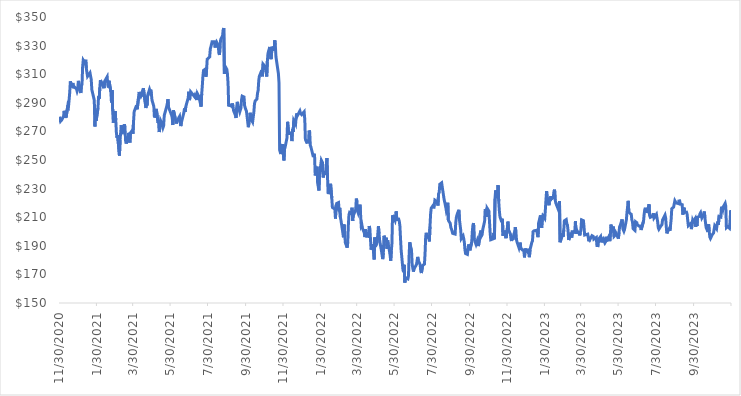
| Category | Adj Close |
|---|---|
| 11/30/20 | 280.23 |
| 12/1/20 | 279.11 |
| 12/2/20 | 277.06 |
| 12/3/20 | 277.29 |
| 12/4/20 | 278 |
| 12/7/20 | 280.8 |
| 12/8/20 | 284.38 |
| 12/9/20 | 279.42 |
| 12/10/20 | 281.16 |
| 12/11/20 | 279.68 |
| 12/14/20 | 288.33 |
| 12/15/20 | 287.53 |
| 12/16/20 | 292.17 |
| 12/17/20 | 297.35 |
| 12/18/20 | 305 |
| 12/21/20 | 300.88 |
| 12/22/20 | 303.86 |
| 12/23/20 | 300.18 |
| 12/24/20 | 301.39 |
| 12/28/20 | 299.65 |
| 12/29/20 | 298.11 |
| 12/30/20 | 299.41 |
| 12/31/20 | 305.34 |
| 1/4/21 | 296.84 |
| 1/5/21 | 301.7 |
| 1/6/21 | 302.87 |
| 1/7/21 | 315.2 |
| 1/8/21 | 319.85 |
| 1/11/21 | 317.81 |
| 1/12/21 | 320.13 |
| 1/13/21 | 314.33 |
| 1/14/21 | 311.11 |
| 1/15/21 | 308.51 |
| 1/19/21 | 310.97 |
| 1/20/21 | 308.58 |
| 1/21/21 | 306.46 |
| 1/22/21 | 299.17 |
| 1/25/21 | 293.64 |
| 1/26/21 | 291.75 |
| 1/27/21 | 273.47 |
| 1/28/21 | 284.22 |
| 1/29/21 | 277.43 |
| 2/1/21 | 286.32 |
| 2/2/21 | 294.61 |
| 2/3/21 | 292.85 |
| 2/4/21 | 300.49 |
| 2/5/21 | 305.86 |
| 2/8/21 | 302.81 |
| 2/9/21 | 304.5 |
| 2/10/21 | 301.71 |
| 2/11/21 | 300.21 |
| 2/12/21 | 305.14 |
| 2/16/21 | 308.22 |
| 2/17/21 | 302.52 |
| 2/18/21 | 300.72 |
| 2/19/21 | 305.4 |
| 2/22/21 | 297.7 |
| 2/23/21 | 290.25 |
| 2/24/21 | 298.91 |
| 2/25/21 | 284.03 |
| 2/26/21 | 276 |
| 3/1/21 | 284.27 |
| 3/2/21 | 277.92 |
| 3/3/21 | 269.3 |
| 3/4/21 | 265.44 |
| 3/5/21 | 267.39 |
| 3/8/21 | 253.1 |
| 3/9/21 | 263.97 |
| 3/10/21 | 263.64 |
| 3/11/21 | 274.36 |
| 3/12/21 | 268.11 |
| 3/15/21 | 273.02 |
| 3/16/21 | 275.01 |
| 3/17/21 | 272.84 |
| 3/18/21 | 263.44 |
| 3/19/21 | 261.5 |
| 3/22/21 | 265.96 |
| 3/23/21 | 269 |
| 3/24/21 | 263.18 |
| 3/25/21 | 262.19 |
| 3/26/21 | 269.01 |
| 3/29/21 | 270.78 |
| 3/30/21 | 268.43 |
| 3/31/21 | 277.15 |
| 4/1/21 | 283.9 |
| 4/5/21 | 288.32 |
| 4/6/21 | 285.5 |
| 4/7/21 | 286.12 |
| 4/8/21 | 293.43 |
| 4/9/21 | 297.57 |
| 4/12/21 | 294.5 |
| 4/13/21 | 295.35 |
| 4/14/21 | 294.35 |
| 4/15/21 | 298.86 |
| 4/16/21 | 300.16 |
| 4/19/21 | 290.2 |
| 4/20/21 | 286.36 |
| 4/21/21 | 288.87 |
| 4/22/21 | 288 |
| 4/23/21 | 295.27 |
| 4/26/21 | 299.34 |
| 4/27/21 | 297.87 |
| 4/28/21 | 299.23 |
| 4/29/21 | 296.28 |
| 4/30/21 | 291.91 |
| 5/3/21 | 287.5 |
| 5/4/21 | 279.73 |
| 5/5/21 | 281.08 |
| 5/6/21 | 284.35 |
| 5/7/21 | 285.76 |
| 5/10/21 | 276.05 |
| 5/11/21 | 277.42 |
| 5/12/21 | 269.54 |
| 5/13/21 | 269.72 |
| 5/14/21 | 277.63 |
| 5/17/21 | 274.78 |
| 5/18/21 | 272.75 |
| 5/19/21 | 273.97 |
| 5/20/21 | 281.16 |
| 5/21/21 | 281.68 |
| 5/24/21 | 287.48 |
| 5/25/21 | 289.47 |
| 5/26/21 | 292.51 |
| 5/27/21 | 286.67 |
| 5/28/21 | 285.86 |
| 6/1/21 | 281.3 |
| 6/2/21 | 279.67 |
| 6/3/21 | 274.47 |
| 6/4/21 | 284.78 |
| 6/7/21 | 278.89 |
| 6/8/21 | 278.66 |
| 6/9/21 | 275.5 |
| 6/10/21 | 277.5 |
| 6/11/21 | 277.51 |
| 6/14/21 | 280.52 |
| 6/15/21 | 276.76 |
| 6/16/21 | 273.71 |
| 6/17/21 | 276.34 |
| 6/18/21 | 277.98 |
| 6/21/21 | 283.22 |
| 6/22/21 | 286.07 |
| 6/23/21 | 283.67 |
| 6/24/21 | 286.96 |
| 6/25/21 | 288.74 |
| 6/28/21 | 293.36 |
| 6/29/21 | 297.74 |
| 6/30/21 | 291.9 |
| 7/1/21 | 293.7 |
| 7/2/21 | 297.74 |
| 7/6/21 | 295.6 |
| 7/7/21 | 296.11 |
| 7/8/21 | 294.47 |
| 7/9/21 | 295.38 |
| 7/12/21 | 291.93 |
| 7/13/21 | 296.42 |
| 7/14/21 | 297.1 |
| 7/15/21 | 294.79 |
| 7/16/21 | 293.33 |
| 7/19/21 | 287.31 |
| 7/20/21 | 296.12 |
| 7/21/21 | 301.78 |
| 7/22/21 | 308.51 |
| 7/23/21 | 312.65 |
| 7/26/21 | 313.62 |
| 7/27/21 | 308.25 |
| 7/28/21 | 313.13 |
| 7/29/21 | 320.5 |
| 7/30/21 | 321.13 |
| 8/2/21 | 322.07 |
| 8/3/21 | 327.61 |
| 8/4/21 | 329.09 |
| 8/5/21 | 328.82 |
| 8/6/21 | 332.77 |
| 8/9/21 | 332.77 |
| 8/10/21 | 331.28 |
| 8/11/21 | 328.64 |
| 8/12/21 | 332.05 |
| 8/13/21 | 332.78 |
| 8/16/21 | 330.18 |
| 8/17/21 | 324.7 |
| 8/18/21 | 323.52 |
| 8/19/21 | 330.35 |
| 8/20/21 | 334.38 |
| 8/23/21 | 336.76 |
| 8/24/21 | 341.07 |
| 8/25/21 | 342.27 |
| 8/26/21 | 310.19 |
| 8/27/21 | 315.64 |
| 8/30/21 | 313.39 |
| 8/31/21 | 310.09 |
| 9/1/21 | 303.24 |
| 9/2/21 | 287.47 |
| 9/3/21 | 288.75 |
| 9/7/21 | 287.46 |
| 9/8/21 | 289.56 |
| 9/9/21 | 287.68 |
| 9/10/21 | 284.43 |
| 9/13/21 | 281.28 |
| 9/14/21 | 279.35 |
| 9/15/21 | 286.62 |
| 9/16/21 | 290.68 |
| 9/17/21 | 288.15 |
| 9/20/21 | 283.6 |
| 9/21/21 | 283.19 |
| 9/22/21 | 286.42 |
| 9/23/21 | 292.16 |
| 9/24/21 | 294.67 |
| 9/27/21 | 294.06 |
| 9/28/21 | 287.85 |
| 9/29/21 | 287.99 |
| 9/30/21 | 285.17 |
| 10/1/21 | 284.06 |
| 10/4/21 | 272.93 |
| 10/5/21 | 275.98 |
| 10/6/21 | 277.42 |
| 10/7/21 | 283.02 |
| 10/8/21 | 278.94 |
| 10/11/21 | 276.54 |
| 10/12/21 | 275.91 |
| 10/13/21 | 283.45 |
| 10/14/21 | 289.17 |
| 10/15/21 | 291.19 |
| 10/18/21 | 292.67 |
| 10/19/21 | 296.69 |
| 10/20/21 | 298.64 |
| 10/21/21 | 305.68 |
| 10/22/21 | 308.58 |
| 10/25/21 | 311.79 |
| 10/26/21 | 312.8 |
| 10/27/21 | 308.51 |
| 10/28/21 | 317.1 |
| 10/29/21 | 317.61 |
| 11/1/21 | 315.01 |
| 11/2/21 | 314.92 |
| 11/3/21 | 308.37 |
| 11/4/21 | 318.97 |
| 11/5/21 | 324.52 |
| 11/8/21 | 329.07 |
| 11/9/21 | 329.4 |
| 11/10/21 | 320.53 |
| 11/11/21 | 325.21 |
| 11/12/21 | 329.32 |
| 11/15/21 | 326.39 |
| 11/16/21 | 333.64 |
| 11/17/21 | 330.55 |
| 11/18/21 | 322.18 |
| 11/19/21 | 322.52 |
| 11/22/21 | 310.48 |
| 11/23/21 | 304 |
| 11/24/21 | 256.9 |
| 11/26/21 | 254.17 |
| 11/29/21 | 261.15 |
| 11/30/21 | 254.19 |
| 12/1/21 | 249.68 |
| 12/2/21 | 257.66 |
| 12/3/21 | 259.02 |
| 12/6/21 | 265.56 |
| 12/7/21 | 276.7 |
| 12/8/21 | 276.29 |
| 12/9/21 | 267.67 |
| 12/10/21 | 269 |
| 12/13/21 | 268.88 |
| 12/14/21 | 263.22 |
| 12/15/21 | 271.73 |
| 12/16/21 | 269.61 |
| 12/17/21 | 277.65 |
| 12/20/21 | 275.12 |
| 12/21/21 | 280.42 |
| 12/22/21 | 282.61 |
| 12/23/21 | 280.99 |
| 12/27/21 | 284.3 |
| 12/28/21 | 282.77 |
| 12/29/21 | 282.57 |
| 12/30/21 | 281.71 |
| 12/31/21 | 281.19 |
| 1/3/22 | 283.72 |
| 1/4/22 | 278.19 |
| 1/5/22 | 264.32 |
| 1/6/22 | 264.11 |
| 1/7/22 | 262.32 |
| 1/10/22 | 262.39 |
| 1/11/22 | 270.63 |
| 1/12/22 | 269.6 |
| 1/13/22 | 260.17 |
| 1/14/22 | 259.1 |
| 1/18/22 | 252.03 |
| 1/19/22 | 254.35 |
| 1/20/22 | 252.41 |
| 1/21/22 | 239.19 |
| 1/24/22 | 245.35 |
| 1/25/22 | 233.78 |
| 1/26/22 | 233.28 |
| 1/27/22 | 228.66 |
| 1/28/22 | 239.54 |
| 1/31/22 | 249.79 |
| 2/1/22 | 249.77 |
| 2/2/22 | 248 |
| 2/3/22 | 237.76 |
| 2/4/22 | 241.24 |
| 2/7/22 | 240.48 |
| 2/8/22 | 241.1 |
| 2/9/22 | 251.34 |
| 2/10/22 | 238.52 |
| 2/11/22 | 227.13 |
| 2/14/22 | 226.9 |
| 2/15/22 | 233.38 |
| 2/16/22 | 233.74 |
| 2/17/22 | 223.39 |
| 2/18/22 | 216.84 |
| 2/22/22 | 215.65 |
| 2/23/22 | 209.02 |
| 2/24/22 | 218.18 |
| 2/25/22 | 219.62 |
| 2/28/22 | 220.23 |
| 3/1/22 | 214 |
| 3/2/22 | 216.51 |
| 3/3/22 | 210 |
| 3/4/22 | 207.66 |
| 3/7/22 | 199.09 |
| 3/8/22 | 195.95 |
| 3/9/22 | 204.88 |
| 3/10/22 | 199.79 |
| 3/11/22 | 192.31 |
| 3/14/22 | 188.7 |
| 3/15/22 | 192.43 |
| 3/16/22 | 204.5 |
| 3/17/22 | 211.65 |
| 3/18/22 | 213.3 |
| 3/21/22 | 212.38 |
| 3/22/22 | 216.66 |
| 3/23/22 | 207.34 |
| 3/24/22 | 213.05 |
| 3/25/22 | 212.14 |
| 3/28/22 | 215.41 |
| 3/29/22 | 223 |
| 3/30/22 | 221 |
| 3/31/22 | 214.35 |
| 4/1/22 | 213.04 |
| 4/4/22 | 218.77 |
| 4/5/22 | 211.55 |
| 4/6/22 | 203.94 |
| 4/7/22 | 204.77 |
| 4/8/22 | 202.25 |
| 4/11/22 | 199.03 |
| 4/12/22 | 196.14 |
| 4/13/22 | 201.74 |
| 4/14/22 | 196.73 |
| 4/18/22 | 196.54 |
| 4/19/22 | 203.8 |
| 4/20/22 | 201.92 |
| 4/21/22 | 195.13 |
| 4/22/22 | 187.31 |
| 4/25/22 | 191.15 |
| 4/26/22 | 185.59 |
| 4/27/22 | 180.47 |
| 4/28/22 | 195.84 |
| 4/29/22 | 189.28 |
| 5/2/22 | 192.9 |
| 5/3/22 | 193.22 |
| 5/4/22 | 203.75 |
| 5/5/22 | 198.39 |
| 5/6/22 | 193.77 |
| 5/9/22 | 186.32 |
| 5/10/22 | 186.41 |
| 5/11/22 | 180.68 |
| 5/12/22 | 185.05 |
| 5/13/22 | 197.07 |
| 5/16/22 | 192.58 |
| 5/17/22 | 195.64 |
| 5/18/22 | 187.98 |
| 5/19/22 | 193.72 |
| 5/20/22 | 191.41 |
| 5/23/22 | 183.51 |
| 5/24/22 | 179.55 |
| 5/25/22 | 186.53 |
| 5/26/22 | 191.63 |
| 5/27/22 | 211.38 |
| 5/31/22 | 207.75 |
| 6/1/22 | 207.38 |
| 6/2/22 | 214.09 |
| 6/3/22 | 208.37 |
| 6/6/22 | 208.6 |
| 6/7/22 | 207.17 |
| 6/8/22 | 203.73 |
| 6/9/22 | 195.06 |
| 6/10/22 | 187.08 |
| 6/13/22 | 173.1 |
| 6/14/22 | 171.59 |
| 6/15/22 | 176.71 |
| 6/16/22 | 164.31 |
| 6/17/22 | 167.77 |
| 6/21/22 | 166.88 |
| 6/22/22 | 169.15 |
| 6/23/22 | 183.41 |
| 6/24/22 | 192.48 |
| 6/27/22 | 185.87 |
| 6/28/22 | 176.81 |
| 6/29/22 | 176.85 |
| 6/30/22 | 171.96 |
| 7/1/22 | 173.86 |
| 7/5/22 | 176.9 |
| 7/6/22 | 176.73 |
| 7/7/22 | 182.25 |
| 7/8/22 | 179.83 |
| 7/11/22 | 176.72 |
| 7/12/22 | 172.33 |
| 7/13/22 | 170.95 |
| 7/14/22 | 170.96 |
| 7/15/22 | 176.21 |
| 7/18/22 | 177.22 |
| 7/19/22 | 184.76 |
| 7/20/22 | 196.38 |
| 7/21/22 | 199.1 |
| 7/22/22 | 195.95 |
| 7/25/22 | 195.71 |
| 7/26/22 | 193.07 |
| 7/27/22 | 203.41 |
| 7/28/22 | 212.16 |
| 7/29/22 | 216.32 |
| 8/1/22 | 218.14 |
| 8/2/22 | 216.18 |
| 8/3/22 | 218.44 |
| 8/4/22 | 221.94 |
| 8/5/22 | 221.7 |
| 8/8/22 | 220.69 |
| 8/9/22 | 218.14 |
| 8/10/22 | 226.32 |
| 8/11/22 | 227.26 |
| 8/12/22 | 233.01 |
| 8/15/22 | 234.04 |
| 8/16/22 | 233.64 |
| 8/17/22 | 228.2 |
| 8/18/22 | 228.86 |
| 8/19/22 | 222.59 |
| 8/22/22 | 216.4 |
| 8/23/22 | 213.63 |
| 8/24/22 | 214.43 |
| 8/25/22 | 220.15 |
| 8/26/22 | 207.77 |
| 8/29/22 | 205.71 |
| 8/30/22 | 202.81 |
| 8/31/22 | 201.74 |
| 9/1/22 | 201.95 |
| 9/2/22 | 198.69 |
| 9/6/22 | 198.18 |
| 9/7/22 | 206.19 |
| 9/8/22 | 209.82 |
| 9/9/22 | 211.68 |
| 9/12/22 | 215.16 |
| 9/13/22 | 208.34 |
| 9/14/22 | 208.52 |
| 9/15/22 | 201.3 |
| 9/16/22 | 194.97 |
| 9/19/22 | 196.89 |
| 9/20/22 | 194.97 |
| 9/21/22 | 192.42 |
| 9/22/22 | 187.15 |
| 9/23/22 | 184.56 |
| 9/26/22 | 183.99 |
| 9/27/22 | 187.96 |
| 9/28/22 | 190.98 |
| 9/29/22 | 189.46 |
| 9/30/22 | 186.8 |
| 10/3/22 | 192.46 |
| 10/4/22 | 199.99 |
| 10/5/22 | 204.53 |
| 10/6/22 | 205.87 |
| 10/7/22 | 194.74 |
| 10/10/22 | 191.03 |
| 10/11/22 | 191.03 |
| 10/12/22 | 193.64 |
| 10/13/22 | 193.85 |
| 10/14/22 | 189.81 |
| 10/17/22 | 198.7 |
| 10/18/22 | 200.7 |
| 10/19/22 | 197.02 |
| 10/20/22 | 197.83 |
| 10/21/22 | 201.39 |
| 10/24/22 | 207.09 |
| 10/25/22 | 215.72 |
| 10/26/22 | 214.56 |
| 10/27/22 | 210.15 |
| 10/28/22 | 216.39 |
| 10/31/22 | 214.3 |
| 11/1/22 | 214.05 |
| 11/2/22 | 199.38 |
| 11/3/22 | 194.22 |
| 11/4/22 | 193.69 |
| 11/7/22 | 194.88 |
| 11/8/22 | 199.01 |
| 11/9/22 | 194.61 |
| 11/10/22 | 222.96 |
| 11/11/22 | 228.8 |
| 11/14/22 | 223.31 |
| 11/15/22 | 232.3 |
| 11/16/22 | 221.14 |
| 11/17/22 | 214.68 |
| 11/18/22 | 210.37 |
| 11/21/22 | 206.5 |
| 11/22/22 | 208.9 |
| 11/23/22 | 197.07 |
| 11/25/22 | 200.66 |
| 11/28/22 | 195.35 |
| 11/29/22 | 195.18 |
| 11/30/22 | 201.95 |
| 12/1/22 | 206.93 |
| 12/2/22 | 201.11 |
| 12/5/22 | 198.39 |
| 12/6/22 | 194.61 |
| 12/7/22 | 193.34 |
| 12/8/22 | 196.63 |
| 12/9/22 | 194.31 |
| 12/12/22 | 199.88 |
| 12/13/22 | 203.02 |
| 12/14/22 | 200.06 |
| 12/15/22 | 194.11 |
| 12/16/22 | 192.4 |
| 12/19/22 | 188.54 |
| 12/20/22 | 187.92 |
| 12/21/22 | 192.23 |
| 12/22/22 | 188.1 |
| 12/23/22 | 188.16 |
| 12/27/22 | 186.29 |
| 12/28/22 | 181.9 |
| 12/29/22 | 188.12 |
| 12/30/22 | 186.87 |
| 1/3/23 | 185.15 |
| 1/4/23 | 187.96 |
| 1/5/23 | 182.07 |
| 1/6/23 | 187.19 |
| 1/9/23 | 192.47 |
| 1/10/23 | 193.43 |
| 1/11/23 | 199.93 |
| 1/12/23 | 199.96 |
| 1/13/23 | 200.59 |
| 1/17/23 | 200.7 |
| 1/18/23 | 198.02 |
| 1/19/23 | 196.05 |
| 1/20/23 | 205.9 |
| 1/23/23 | 211.29 |
| 1/24/23 | 206.43 |
| 1/25/23 | 202.5 |
| 1/26/23 | 208.46 |
| 1/27/23 | 210.88 |
| 1/30/23 | 209.12 |
| 1/31/23 | 215.16 |
| 2/1/23 | 222.19 |
| 2/2/23 | 228.22 |
| 2/3/23 | 223.66 |
| 2/6/23 | 218.34 |
| 2/7/23 | 223.65 |
| 2/8/23 | 221.32 |
| 2/9/23 | 224.65 |
| 2/10/23 | 222.8 |
| 2/13/23 | 224 |
| 2/14/23 | 228.04 |
| 2/15/23 | 229.28 |
| 2/16/23 | 222.13 |
| 2/17/23 | 219.98 |
| 2/21/23 | 215.55 |
| 2/22/23 | 216.7 |
| 2/23/23 | 221.16 |
| 2/24/23 | 192.53 |
| 2/27/23 | 196.68 |
| 2/28/23 | 198.69 |
| 3/1/23 | 196.38 |
| 3/2/23 | 201.13 |
| 3/3/23 | 207.46 |
| 3/6/23 | 208.33 |
| 3/7/23 | 205.48 |
| 3/8/23 | 204.51 |
| 3/9/23 | 200.49 |
| 3/10/23 | 194.02 |
| 3/13/23 | 197.87 |
| 3/14/23 | 199.22 |
| 3/15/23 | 195.79 |
| 3/16/23 | 200.59 |
| 3/17/23 | 199.11 |
| 3/20/23 | 200.42 |
| 3/21/23 | 207.15 |
| 3/22/23 | 198.38 |
| 3/23/23 | 201.14 |
| 3/24/23 | 200.22 |
| 3/27/23 | 198.75 |
| 3/28/23 | 197.27 |
| 3/29/23 | 199.16 |
| 3/30/23 | 201.61 |
| 3/31/23 | 208.16 |
| 4/3/23 | 207.58 |
| 4/4/23 | 203.32 |
| 4/5/23 | 197.55 |
| 4/6/23 | 197.34 |
| 4/10/23 | 198.14 |
| 4/11/23 | 197.78 |
| 4/12/23 | 193.16 |
| 4/13/23 | 196.31 |
| 4/14/23 | 194.66 |
| 4/17/23 | 197.09 |
| 4/18/23 | 197.45 |
| 4/19/23 | 196.56 |
| 4/20/23 | 194.64 |
| 4/21/23 | 194.09 |
| 4/24/23 | 195.84 |
| 4/25/23 | 190.21 |
| 4/26/23 | 189.9 |
| 4/27/23 | 190.11 |
| 4/28/23 | 194.79 |
| 5/1/23 | 196.47 |
| 5/2/23 | 192.42 |
| 5/3/23 | 193.7 |
| 5/4/23 | 193.03 |
| 5/5/23 | 194.94 |
| 5/8/23 | 191.99 |
| 5/9/23 | 192.73 |
| 5/10/23 | 196.32 |
| 5/11/23 | 193.1 |
| 5/12/23 | 194.45 |
| 5/15/23 | 196.91 |
| 5/16/23 | 193.25 |
| 5/17/23 | 198.46 |
| 5/18/23 | 204.84 |
| 5/19/23 | 200.89 |
| 5/22/23 | 203.49 |
| 5/23/23 | 196.64 |
| 5/24/23 | 196.75 |
| 5/25/23 | 197.56 |
| 5/26/23 | 198.9 |
| 5/30/23 | 195.04 |
| 5/31/23 | 199.39 |
| 6/1/23 | 203.3 |
| 6/2/23 | 204.24 |
| 6/5/23 | 208.43 |
| 6/6/23 | 208.01 |
| 6/7/23 | 201.16 |
| 6/8/23 | 200.16 |
| 6/9/23 | 201.39 |
| 6/12/23 | 208.1 |
| 6/13/23 | 213.29 |
| 6/14/23 | 213.55 |
| 6/15/23 | 221.43 |
| 6/16/23 | 213.5 |
| 6/20/23 | 211.99 |
| 6/21/23 | 207.98 |
| 6/22/23 | 206.7 |
| 6/23/23 | 202 |
| 6/26/23 | 200.78 |
| 6/27/23 | 206.85 |
| 6/28/23 | 206.3 |
| 6/29/23 | 206.18 |
| 6/30/23 | 204.61 |
| 7/3/23 | 203.7 |
| 7/5/23 | 203.85 |
| 7/6/23 | 201.05 |
| 7/7/23 | 201.57 |
| 7/10/23 | 207.33 |
| 7/11/23 | 212.05 |
| 7/12/23 | 215.32 |
| 7/13/23 | 216.59 |
| 7/14/23 | 214.14 |
| 7/17/23 | 213.73 |
| 7/18/23 | 217.24 |
| 7/19/23 | 219.07 |
| 7/20/23 | 210.97 |
| 7/21/23 | 209.9 |
| 7/24/23 | 210.53 |
| 7/25/23 | 210.76 |
| 7/26/23 | 212.75 |
| 7/27/23 | 209.46 |
| 7/28/23 | 209.79 |
| 7/31/23 | 211.99 |
| 8/1/23 | 212.45 |
| 8/2/23 | 206.78 |
| 8/3/23 | 202.62 |
| 8/4/23 | 201.57 |
| 8/7/23 | 203.72 |
| 8/8/23 | 203.23 |
| 8/9/23 | 204.77 |
| 8/10/23 | 208.06 |
| 8/11/23 | 207.96 |
| 8/14/23 | 211.48 |
| 8/15/23 | 209.53 |
| 8/16/23 | 203.65 |
| 8/17/23 | 198.7 |
| 8/18/23 | 199.68 |
| 8/21/23 | 202.02 |
| 8/22/23 | 200.58 |
| 8/23/23 | 204.36 |
| 8/24/23 | 208.6 |
| 8/25/23 | 215.92 |
| 8/28/23 | 217.09 |
| 8/29/23 | 219.4 |
| 8/30/23 | 221.55 |
| 8/31/23 | 221.94 |
| 9/1/23 | 220.02 |
| 9/5/23 | 219.46 |
| 9/6/23 | 222.2 |
| 9/7/23 | 221.01 |
| 9/8/23 | 219.19 |
| 9/11/23 | 218.74 |
| 9/12/23 | 211.8 |
| 9/13/23 | 212.26 |
| 9/14/23 | 216.67 |
| 9/15/23 | 213.35 |
| 9/18/23 | 213.52 |
| 9/19/23 | 212.06 |
| 9/20/23 | 207.73 |
| 9/21/23 | 204.06 |
| 9/22/23 | 204.04 |
| 9/25/23 | 205.67 |
| 9/26/23 | 201.66 |
| 9/27/23 | 202.28 |
| 9/28/23 | 207.89 |
| 9/29/23 | 206.91 |
| 10/2/23 | 208.99 |
| 10/3/23 | 203.28 |
| 10/4/23 | 207.06 |
| 10/5/23 | 203.96 |
| 10/6/23 | 210.04 |
| 10/9/23 | 210.56 |
| 10/10/23 | 212.47 |
| 10/11/23 | 213.2 |
| 10/12/23 | 212.77 |
| 10/13/23 | 209.47 |
| 10/16/23 | 211.78 |
| 10/17/23 | 213.99 |
| 10/18/23 | 209.64 |
| 10/19/23 | 206.07 |
| 10/20/23 | 202.69 |
| 10/23/23 | 199.72 |
| 10/24/23 | 205.04 |
| 10/25/23 | 200.21 |
| 10/26/23 | 196.12 |
| 10/27/23 | 195.15 |
| 10/30/23 | 197.79 |
| 10/31/23 | 197.63 |
| 11/1/23 | 198.93 |
| 11/2/23 | 199.24 |
| 11/3/23 | 203.98 |
| 11/6/23 | 201.99 |
| 11/7/23 | 205.31 |
| 11/8/23 | 206.93 |
| 11/9/23 | 204.68 |
| 11/10/23 | 210.58 |
| 11/13/23 | 210.1 |
| 11/14/23 | 217.36 |
| 11/15/23 | 216.11 |
| 11/16/23 | 215.02 |
| 11/17/23 | 217.33 |
| 11/20/23 | 219.7 |
| 11/21/23 | 217.67 |
| 11/22/23 | 202.66 |
| 11/24/23 | 203.42 |
| 11/27/23 | 202.26 |
| 11/28/23 | 207.37 |
| 11/29/23 | 215.055 |